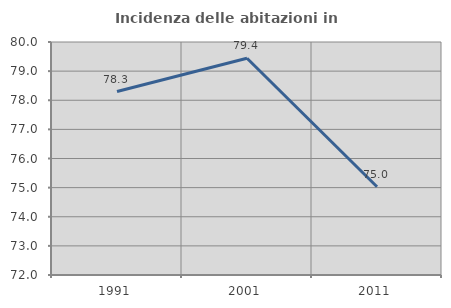
| Category | Incidenza delle abitazioni in proprietà  |
|---|---|
| 1991.0 | 78.299 |
| 2001.0 | 79.444 |
| 2011.0 | 75.031 |